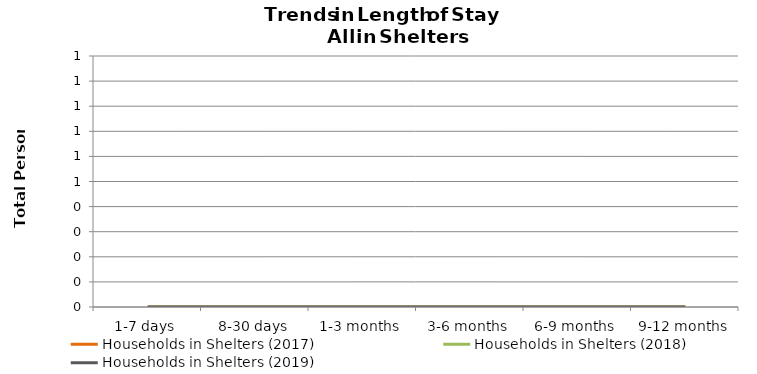
| Category | Households in Shelters (2017) | Households in Shelters (2018) | Households in Shelters (2019) |
|---|---|---|---|
| 1-7 days | 0 | 0 | 0 |
| 8-30 days | 0 | 0 | 0 |
| 1-3 months | 0 | 0 | 0 |
| 3-6 months | 0 | 0 | 0 |
| 6-9 months | 0 | 0 | 0 |
| 9-12 months | 0 | 0 | 0 |